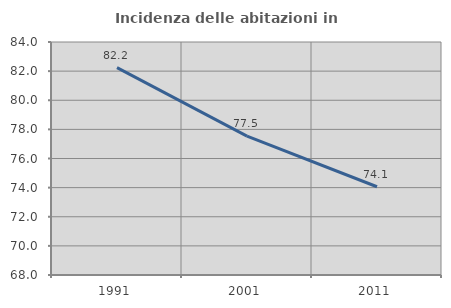
| Category | Incidenza delle abitazioni in proprietà  |
|---|---|
| 1991.0 | 82.24 |
| 2001.0 | 77.538 |
| 2011.0 | 74.059 |